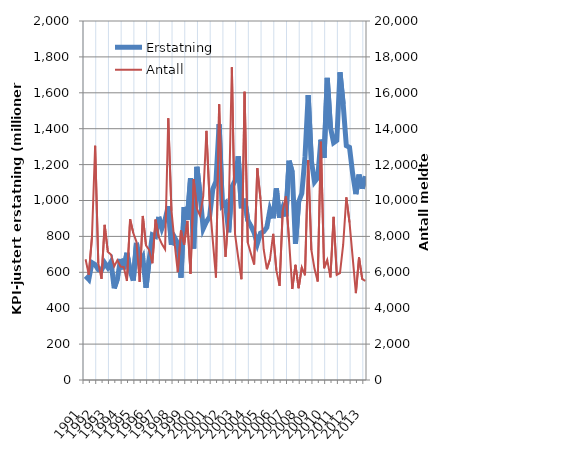
| Category | Erstatning |
|---|---|
| 1991.0 | 579.236 |
| nan | 560.347 |
| nan | 653.814 |
| nan | 642.701 |
| 1992.0 | 614.952 |
| nan | 611.025 |
| nan | 652.408 |
| nan | 626.247 |
| 1993.0 | 657.585 |
| nan | 510.694 |
| nan | 563.454 |
| nan | 674.327 |
| 1994.0 | 617.436 |
| nan | 708.299 |
| nan | 607.065 |
| nan | 554.264 |
| 1995.0 | 763.921 |
| nan | 645.689 |
| nan | 681.297 |
| nan | 513.793 |
| 1996.0 | 669.415 |
| nan | 808.711 |
| nan | 800.646 |
| nan | 908.475 |
| 1997.0 | 844.984 |
| nan | 893.574 |
| nan | 968.756 |
| nan | 753.146 |
| 1998.0 | 793.428 |
| nan | 760.328 |
| nan | 569.839 |
| nan | 963.774 |
| 1999.0 | 892.976 |
| nan | 1124.486 |
| nan | 732.584 |
| nan | 1187.678 |
| 2000.0 | 1029.97 |
| nan | 842.91 |
| nan | 881.241 |
| nan | 909.465 |
| 2001.0 | 1063.079 |
| nan | 1106.589 |
| nan | 1424.857 |
| nan | 971.054 |
| 2002.0 | 986.281 |
| nan | 823.161 |
| nan | 1074.099 |
| nan | 1110.981 |
| 2003.0 | 1246.58 |
| nan | 956.892 |
| nan | 1010.101 |
| nan | 889.576 |
| 2004.0 | 857.951 |
| nan | 820.729 |
| nan | 758.98 |
| nan | 817.677 |
| 2005.0 | 826.537 |
| nan | 850.336 |
| nan | 949.939 |
| nan | 901.449 |
| 2006.0 | 1067.428 |
| nan | 904.085 |
| nan | 958.783 |
| nan | 912.071 |
| 2007.0 | 1221.405 |
| nan | 1157.053 |
| nan | 758.06 |
| nan | 991.7 |
| 2008.0 | 1038.696 |
| nan | 1242.699 |
| nan | 1586.727 |
| nan | 1222.326 |
| 2009.0 | 1103.655 |
| nan | 1126.779 |
| nan | 1339.253 |
| nan | 1237.402 |
| 2010.0 | 1683.084 |
| nan | 1408.498 |
| nan | 1322.431 |
| nan | 1335.187 |
| 2011.0 | 1714.356 |
| nan | 1538.082 |
| nan | 1305.267 |
| nan | 1295.738 |
| 2012.0 | 1147.694 |
| nan | 1035.433 |
| nan | 1144.252 |
| nan | 1066.144 |
| 2013.0 | 1134.371 |